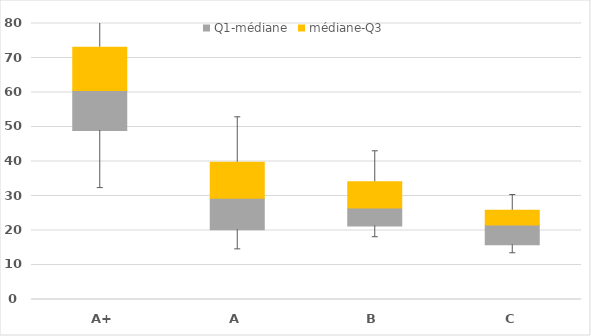
| Category | 1er quartile txtib | Q1-médiane | médiane-Q3 |
|---|---|---|---|
| A+ | 49 | 11.6 | 12.55 |
| A | 20.22 | 9.14 | 10.44 |
| B | 21.33 | 5.22 | 7.59 |
| C | 15.86 | 5.76 | 4.24 |